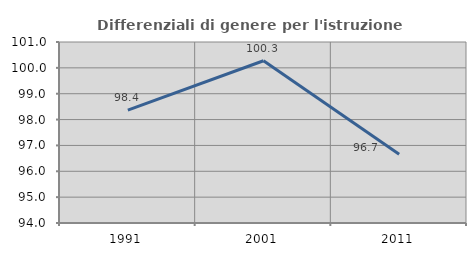
| Category | Differenziali di genere per l'istruzione superiore |
|---|---|
| 1991.0 | 98.368 |
| 2001.0 | 100.274 |
| 2011.0 | 96.657 |